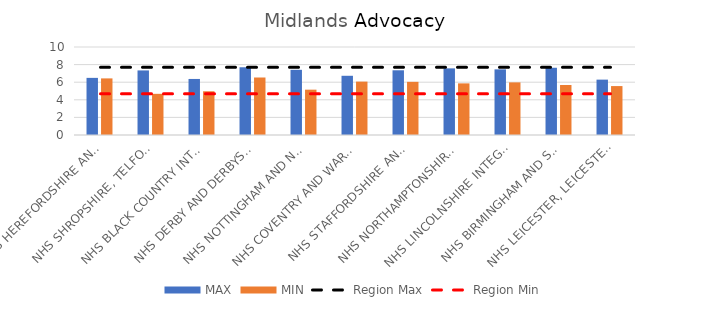
| Category | MAX | MIN |
|---|---|---|
| NHS HEREFORDSHIRE AND WORCESTERSHIRE INTEGRATED CARE BOARD | 6.492 | 6.432 |
| NHS SHROPSHIRE, TELFORD AND WREKIN INTEGRATED CARE BOARD | 7.339 | 4.679 |
| NHS BLACK COUNTRY INTEGRATED CARE BOARD | 6.369 | 4.97 |
| NHS DERBY AND DERBYSHIRE INTEGRATED CARE BOARD | 7.698 | 6.535 |
| NHS NOTTINGHAM AND NOTTINGHAMSHIRE INTEGRATED CARE BOARD | 7.406 | 5.152 |
| NHS COVENTRY AND WARWICKSHIRE INTEGRATED CARE BOARD | 6.729 | 6.068 |
| NHS STAFFORDSHIRE AND STOKE-ON-TRENT INTEGRATED CARE BOARD | 7.354 | 6.042 |
| NHS NORTHAMPTONSHIRE INTEGRATED CARE BOARD | 7.571 | 5.866 |
| NHS LINCOLNSHIRE INTEGRATED CARE BOARD | 7.459 | 5.98 |
| NHS BIRMINGHAM AND SOLIHULL INTEGRATED CARE BOARD | 7.641 | 5.681 |
| NHS LEICESTER, LEICESTERSHIRE AND RUTLAND INTEGRATED CARE BOARD | 6.292 | 5.56 |